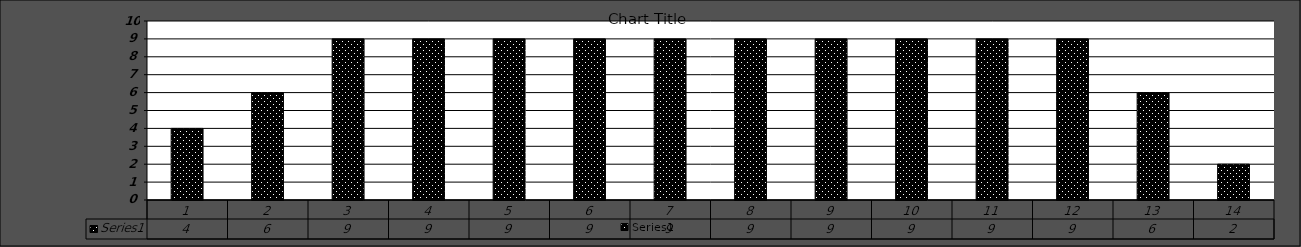
| Category | Series 0 |
|---|---|
| 0 | 4 |
| 1 | 6 |
| 2 | 9 |
| 3 | 9 |
| 4 | 9 |
| 5 | 9 |
| 6 | 9 |
| 7 | 9 |
| 8 | 9 |
| 9 | 9 |
| 10 | 9 |
| 11 | 9 |
| 12 | 6 |
| 13 | 2 |